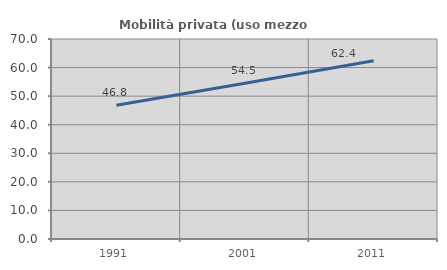
| Category | Mobilità privata (uso mezzo privato) |
|---|---|
| 1991.0 | 46.795 |
| 2001.0 | 54.491 |
| 2011.0 | 62.369 |